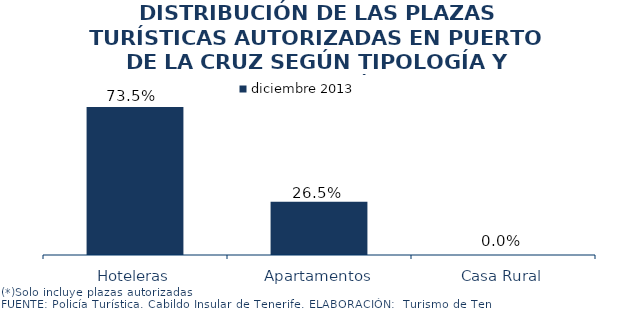
| Category | diciembre 2013 |
|---|---|
| Hoteleras | 0.735 |
| Apartamentos | 0.265 |
| Casa Rural | 0 |